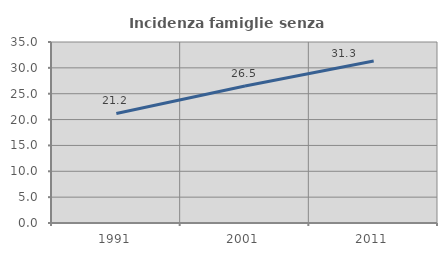
| Category | Incidenza famiglie senza nuclei |
|---|---|
| 1991.0 | 21.185 |
| 2001.0 | 26.477 |
| 2011.0 | 31.343 |